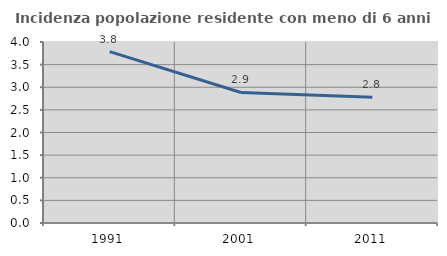
| Category | Incidenza popolazione residente con meno di 6 anni |
|---|---|
| 1991.0 | 3.788 |
| 2001.0 | 2.885 |
| 2011.0 | 2.778 |